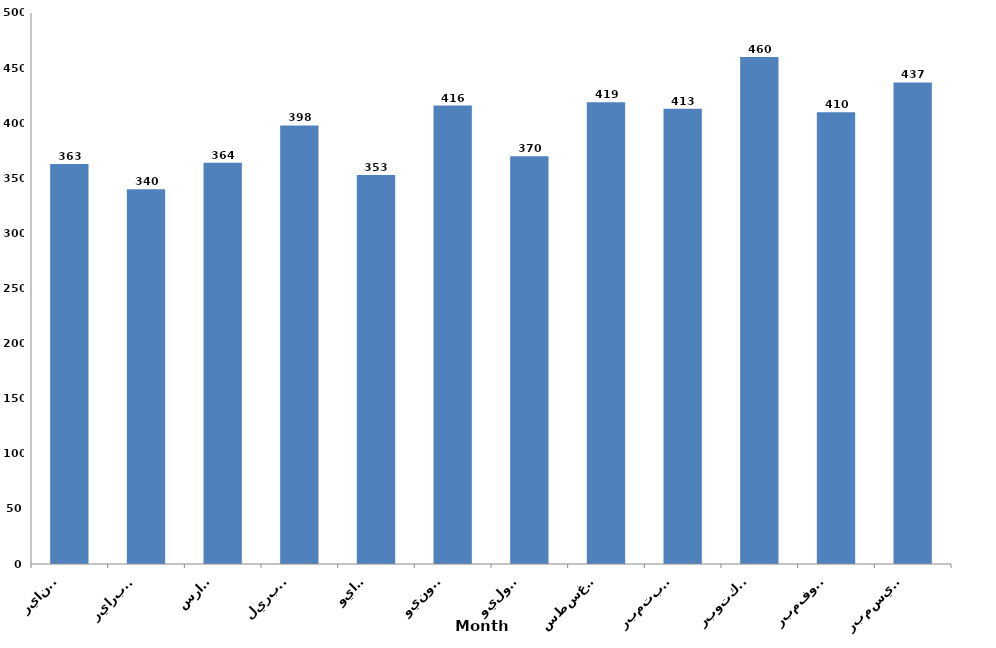
| Category | الشهور
 Month |
|---|---|
| يناير
January | 363 |
| فبراير
February | 340 |
| مارس
March | 364 |
| ابريل
April | 398 |
| مايو
May | 353 |
| يونيو
June | 416 |
| يوليو
July | 370 |
| اغسطس
August | 419 |
| سبتمبر
September | 413 |
| اكتوبر
October | 460 |
| نوفمبر
November | 410 |
| ديسمبر
December | 437 |